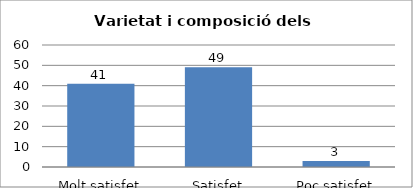
| Category | Series 0 |
|---|---|
| Molt satisfet | 41 |
| Satisfet | 49 |
| Poc satisfet | 3 |